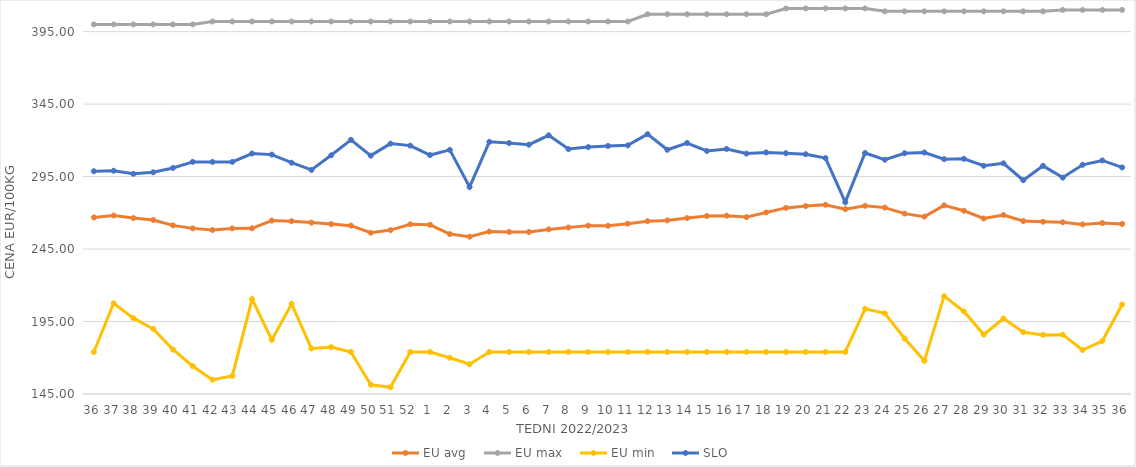
| Category | EU avg | EU max | EU min | SLO |
|---|---|---|---|---|
| 36.0 | 266.807 | 400 | 174 | 298.7 |
| 37.0 | 268.136 | 400 | 207.594 | 299.02 |
| 38.0 | 266.39 | 400 | 197.352 | 296.91 |
| 39.0 | 265.059 | 400 | 189.926 | 297.96 |
| 40.0 | 261.35 | 400 | 175.723 | 300.95 |
| 41.0 | 259.271 | 400 | 164.165 | 305.13 |
| 42.0 | 258.146 | 402 | 154.869 | 305.13 |
| 43.0 | 259.256 | 402 | 157.459 | 305.13 |
| 44.0 | 259.32 | 402 | 210.415 | 310.93 |
| 45.0 | 264.649 | 402 | 182.35 | 310.16 |
| 46.0 | 264.228 | 402 | 207.247 | 304.58 |
| 47.0 | 263.24 | 402 | 176.378 | 299.59 |
| 48.0 | 262.225 | 402 | 177.332 | 309.69 |
| 49.0 | 261.152 | 402 | 174 | 320.38 |
| 50.0 | 256.24 | 402 | 151.434 | 309.44 |
| 51.0 | 258.071 | 402 | 149.638 | 317.74 |
| 52.0 | 262.088 | 402 | 174 | 316.36 |
| 1.0 | 261.716 | 402 | 174 | 309.84 |
| 2.0 | 255.331 | 402 | 169.983 | 313.4 |
| 3.0 | 253.546 | 402 | 165.574 | 287.81 |
| 4.0 | 257.051 | 402 | 174 | 318.98 |
| 5.0 | 256.808 | 402 | 174 | 318.13 |
| 6.0 | 256.75 | 402 | 174 | 316.99 |
| 7.0 | 258.565 | 402 | 174 | 323.47 |
| 8.0 | 259.872 | 402 | 174 | 314 |
| 9.0 | 261.164 | 402 | 174 | 315.35 |
| 10.0 | 261.06 | 402 | 174 | 316.13 |
| 11.0 | 262.513 | 402 | 174 | 316.55 |
| 12.0 | 264.228 | 407 | 174 | 324.27 |
| 13.0 | 264.768 | 407 | 174 | 313.49 |
| 14.0 | 266.385 | 407 | 174 | 318.17 |
| 15.0 | 267.797 | 407 | 174 | 312.7 |
| 16.0 | 268.021 | 407 | 174 | 314.07 |
| 17.0 | 267.041 | 407 | 174 | 310.87 |
| 18.0 | 270.255 | 407 | 174 | 311.69 |
| 19.0 | 273.406 | 411 | 174 | 311.13 |
| 20.0 | 274.631 | 411 | 174 | 310.42 |
| 21.0 | 275.561 | 411 | 174 | 307.76 |
| 22.0 | 272.542 | 411 | 174 | 277.34 |
| 23.0 | 274.85 | 411 | 203.728 | 311.28 |
| 24.0 | 273.59 | 409 | 200.686 | 306.64 |
| 25.0 | 269.439 | 409 | 183.275 | 311.1 |
| 26.0 | 267.345 | 409 | 167.858 | 311.62 |
| 27.0 | 275.123 | 409 | 212.506 | 307.04 |
| 28.0 | 271.42 | 409 | 201.945 | 307.23 |
| 29.0 | 266.08 | 409 | 186.018 | 302.45 |
| 30.0 | 268.49 | 409 | 197.093 | 304.14 |
| 31.0 | 264.334 | 409 | 187.684 | 292.49 |
| 32.0 | 263.844 | 409 | 185.774 | 302.41 |
| 33.0 | 263.441 | 410 | 185.951 | 294.3 |
| 34.0 | 262.028 | 410 | 175.332 | 303.1 |
| 35.0 | 262.997 | 410 | 181.543 | 306.13 |
| 36.0 | 262.329 | 410 | 206.8 | 301.32 |